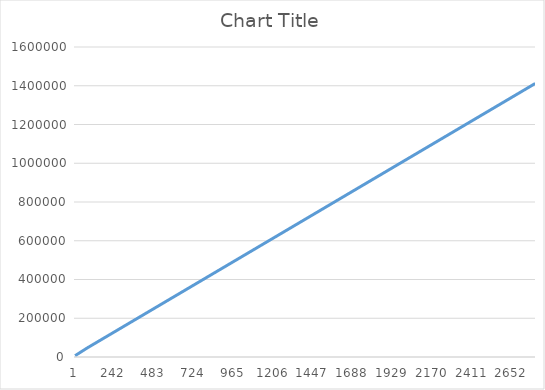
| Category | Series 0 |
|---|---|
| 0 | 6740 |
| 1 | 7282 |
| 2 | 7826 |
| 3 | 8370 |
| 4 | 8914 |
| 5 | 9458 |
| 6 | 10002 |
| 7 | 10546 |
| 8 | 11090 |
| 9 | 11634 |
| 10 | 12178 |
| 11 | 12722 |
| 12 | 13266 |
| 13 | 13810 |
| 14 | 14354 |
| 15 | 14898 |
| 16 | 15442 |
| 17 | 15986 |
| 18 | 16530 |
| 19 | 17074 |
| 20 | 17618 |
| 21 | 18162 |
| 22 | 18706 |
| 23 | 19250 |
| 24 | 19794 |
| 25 | 20338 |
| 26 | 20882 |
| 27 | 21426 |
| 28 | 21970 |
| 29 | 22514 |
| 30 | 23058 |
| 31 | 23602 |
| 32 | 24146 |
| 33 | 24690 |
| 34 | 25234 |
| 35 | 25778 |
| 36 | 26322 |
| 37 | 26866 |
| 38 | 27410 |
| 39 | 27954 |
| 40 | 28498 |
| 41 | 29042 |
| 42 | 29586 |
| 43 | 30130 |
| 44 | 30674 |
| 45 | 31218 |
| 46 | 31762 |
| 47 | 32265 |
| 48 | 32809 |
| 49 | 33353 |
| 50 | 33897 |
| 51 | 34441 |
| 52 | 34985 |
| 53 | 35529 |
| 54 | 36073 |
| 55 | 36617 |
| 56 | 37161 |
| 57 | 37705 |
| 58 | 38249 |
| 59 | 38793 |
| 60 | 39337 |
| 61 | 39881 |
| 62 | 40425 |
| 63 | 40969 |
| 64 | 41513 |
| 65 | 42057 |
| 66 | 42601 |
| 67 | 43145 |
| 68 | 43689 |
| 69 | 44233 |
| 70 | 44777 |
| 71 | 45321 |
| 72 | 45865 |
| 73 | 46409 |
| 74 | 46952 |
| 75 | 47455 |
| 76 | 47958 |
| 77 | 48462 |
| 78 | 48965 |
| 79 | 49468 |
| 80 | 49971 |
| 81 | 50474 |
| 82 | 50977 |
| 83 | 51481 |
| 84 | 51984 |
| 85 | 52487 |
| 86 | 52990 |
| 87 | 53493 |
| 88 | 53997 |
| 89 | 54500 |
| 90 | 55003 |
| 91 | 55506 |
| 92 | 56009 |
| 93 | 56513 |
| 94 | 57016 |
| 95 | 57519 |
| 96 | 58022 |
| 97 | 58525 |
| 98 | 59029 |
| 99 | 59532 |
| 100 | 60035 |
| 101 | 60538 |
| 102 | 61041 |
| 103 | 61545 |
| 104 | 62048 |
| 105 | 62551 |
| 106 | 63054 |
| 107 | 63557 |
| 108 | 64061 |
| 109 | 64564 |
| 110 | 65067 |
| 111 | 65570 |
| 112 | 66073 |
| 113 | 66577 |
| 114 | 67080 |
| 115 | 67583 |
| 116 | 68086 |
| 117 | 68589 |
| 118 | 69092 |
| 119 | 69596 |
| 120 | 70099 |
| 121 | 70602 |
| 122 | 71105 |
| 123 | 71609 |
| 124 | 72112 |
| 125 | 72615 |
| 126 | 73118 |
| 127 | 73621 |
| 128 | 74124 |
| 129 | 74628 |
| 130 | 75131 |
| 131 | 75634 |
| 132 | 76137 |
| 133 | 76640 |
| 134 | 77144 |
| 135 | 77647 |
| 136 | 78150 |
| 137 | 78653 |
| 138 | 79156 |
| 139 | 79660 |
| 140 | 80163 |
| 141 | 80666 |
| 142 | 81169 |
| 143 | 81673 |
| 144 | 82176 |
| 145 | 82692 |
| 146 | 83196 |
| 147 | 83699 |
| 148 | 84202 |
| 149 | 84705 |
| 150 | 85209 |
| 151 | 85712 |
| 152 | 86215 |
| 153 | 86718 |
| 154 | 87221 |
| 155 | 87724 |
| 156 | 88228 |
| 157 | 88731 |
| 158 | 89234 |
| 159 | 89737 |
| 160 | 90240 |
| 161 | 90744 |
| 162 | 91247 |
| 163 | 91750 |
| 164 | 92253 |
| 165 | 92756 |
| 166 | 93260 |
| 167 | 93763 |
| 168 | 94266 |
| 169 | 94769 |
| 170 | 95272 |
| 171 | 95775 |
| 172 | 96279 |
| 173 | 96782 |
| 174 | 97285 |
| 175 | 97788 |
| 176 | 98291 |
| 177 | 98795 |
| 178 | 99298 |
| 179 | 99801 |
| 180 | 100304 |
| 181 | 100807 |
| 182 | 101311 |
| 183 | 101814 |
| 184 | 102317 |
| 185 | 102820 |
| 186 | 103323 |
| 187 | 103827 |
| 188 | 104330 |
| 189 | 104833 |
| 190 | 105336 |
| 191 | 105840 |
| 192 | 106343 |
| 193 | 106846 |
| 194 | 107349 |
| 195 | 107852 |
| 196 | 108355 |
| 197 | 108859 |
| 198 | 109362 |
| 199 | 109865 |
| 200 | 110368 |
| 201 | 110871 |
| 202 | 111375 |
| 203 | 111878 |
| 204 | 112381 |
| 205 | 112884 |
| 206 | 113387 |
| 207 | 113891 |
| 208 | 114394 |
| 209 | 114897 |
| 210 | 115400 |
| 211 | 115903 |
| 212 | 116407 |
| 213 | 116910 |
| 214 | 117413 |
| 215 | 117916 |
| 216 | 118420 |
| 217 | 118923 |
| 218 | 119426 |
| 219 | 119929 |
| 220 | 120432 |
| 221 | 120935 |
| 222 | 121439 |
| 223 | 121942 |
| 224 | 122445 |
| 225 | 122948 |
| 226 | 123451 |
| 227 | 123955 |
| 228 | 124458 |
| 229 | 124961 |
| 230 | 125464 |
| 231 | 125967 |
| 232 | 126471 |
| 233 | 126974 |
| 234 | 127477 |
| 235 | 127980 |
| 236 | 128483 |
| 237 | 128987 |
| 238 | 129490 |
| 239 | 129993 |
| 240 | 130496 |
| 241 | 130999 |
| 242 | 131503 |
| 243 | 132006 |
| 244 | 132509 |
| 245 | 133012 |
| 246 | 133515 |
| 247 | 134018 |
| 248 | 134522 |
| 249 | 135025 |
| 250 | 135528 |
| 251 | 136031 |
| 252 | 136535 |
| 253 | 137038 |
| 254 | 137541 |
| 255 | 138044 |
| 256 | 138547 |
| 257 | 139050 |
| 258 | 139554 |
| 259 | 140057 |
| 260 | 140560 |
| 261 | 141063 |
| 262 | 141566 |
| 263 | 142069 |
| 264 | 142573 |
| 265 | 143076 |
| 266 | 143579 |
| 267 | 144082 |
| 268 | 144586 |
| 269 | 145089 |
| 270 | 145592 |
| 271 | 146095 |
| 272 | 146598 |
| 273 | 147102 |
| 274 | 147605 |
| 275 | 148108 |
| 276 | 148611 |
| 277 | 149114 |
| 278 | 149617 |
| 279 | 150121 |
| 280 | 150624 |
| 281 | 151127 |
| 282 | 151630 |
| 283 | 152133 |
| 284 | 152637 |
| 285 | 153140 |
| 286 | 153643 |
| 287 | 154146 |
| 288 | 154649 |
| 289 | 155153 |
| 290 | 155656 |
| 291 | 156159 |
| 292 | 156662 |
| 293 | 157165 |
| 294 | 157669 |
| 295 | 158172 |
| 296 | 158675 |
| 297 | 159178 |
| 298 | 159681 |
| 299 | 160185 |
| 300 | 160688 |
| 301 | 161191 |
| 302 | 161694 |
| 303 | 162197 |
| 304 | 162701 |
| 305 | 163204 |
| 306 | 163707 |
| 307 | 164237 |
| 308 | 164741 |
| 309 | 165244 |
| 310 | 165747 |
| 311 | 166250 |
| 312 | 166753 |
| 313 | 167257 |
| 314 | 167760 |
| 315 | 168263 |
| 316 | 168766 |
| 317 | 169270 |
| 318 | 169773 |
| 319 | 170276 |
| 320 | 170779 |
| 321 | 171282 |
| 322 | 171786 |
| 323 | 172289 |
| 324 | 172792 |
| 325 | 173295 |
| 326 | 173798 |
| 327 | 174301 |
| 328 | 174805 |
| 329 | 175308 |
| 330 | 175811 |
| 331 | 176314 |
| 332 | 176818 |
| 333 | 177321 |
| 334 | 177824 |
| 335 | 178327 |
| 336 | 178830 |
| 337 | 179333 |
| 338 | 179837 |
| 339 | 180340 |
| 340 | 180843 |
| 341 | 181346 |
| 342 | 181849 |
| 343 | 182353 |
| 344 | 182856 |
| 345 | 183359 |
| 346 | 183862 |
| 347 | 184365 |
| 348 | 184869 |
| 349 | 185372 |
| 350 | 185875 |
| 351 | 186378 |
| 352 | 186881 |
| 353 | 187385 |
| 354 | 187888 |
| 355 | 188391 |
| 356 | 188894 |
| 357 | 189397 |
| 358 | 189901 |
| 359 | 190404 |
| 360 | 190907 |
| 361 | 191410 |
| 362 | 191913 |
| 363 | 192417 |
| 364 | 192920 |
| 365 | 193423 |
| 366 | 193926 |
| 367 | 194429 |
| 368 | 194932 |
| 369 | 195436 |
| 370 | 195939 |
| 371 | 196442 |
| 372 | 196945 |
| 373 | 197448 |
| 374 | 197952 |
| 375 | 198455 |
| 376 | 198958 |
| 377 | 199461 |
| 378 | 199964 |
| 379 | 200468 |
| 380 | 200971 |
| 381 | 201474 |
| 382 | 201977 |
| 383 | 202481 |
| 384 | 202984 |
| 385 | 203487 |
| 386 | 203990 |
| 387 | 204493 |
| 388 | 204996 |
| 389 | 205500 |
| 390 | 206003 |
| 391 | 206506 |
| 392 | 207009 |
| 393 | 207512 |
| 394 | 208016 |
| 395 | 208519 |
| 396 | 209022 |
| 397 | 209525 |
| 398 | 210028 |
| 399 | 210532 |
| 400 | 211035 |
| 401 | 211538 |
| 402 | 212041 |
| 403 | 212544 |
| 404 | 213048 |
| 405 | 213551 |
| 406 | 214054 |
| 407 | 214557 |
| 408 | 215060 |
| 409 | 215564 |
| 410 | 216067 |
| 411 | 216570 |
| 412 | 217073 |
| 413 | 217576 |
| 414 | 218080 |
| 415 | 218583 |
| 416 | 219086 |
| 417 | 219589 |
| 418 | 220092 |
| 419 | 220595 |
| 420 | 221099 |
| 421 | 221602 |
| 422 | 222105 |
| 423 | 222608 |
| 424 | 223111 |
| 425 | 223615 |
| 426 | 224118 |
| 427 | 224621 |
| 428 | 225124 |
| 429 | 225627 |
| 430 | 226131 |
| 431 | 226634 |
| 432 | 227137 |
| 433 | 227640 |
| 434 | 228143 |
| 435 | 228647 |
| 436 | 229150 |
| 437 | 229653 |
| 438 | 230156 |
| 439 | 230659 |
| 440 | 231163 |
| 441 | 231666 |
| 442 | 232169 |
| 443 | 232672 |
| 444 | 233175 |
| 445 | 233678 |
| 446 | 234182 |
| 447 | 234685 |
| 448 | 235188 |
| 449 | 235691 |
| 450 | 236194 |
| 451 | 236698 |
| 452 | 237201 |
| 453 | 237704 |
| 454 | 238207 |
| 455 | 238710 |
| 456 | 239214 |
| 457 | 239717 |
| 458 | 240220 |
| 459 | 240723 |
| 460 | 241227 |
| 461 | 241730 |
| 462 | 242233 |
| 463 | 242736 |
| 464 | 243239 |
| 465 | 243743 |
| 466 | 244246 |
| 467 | 244749 |
| 468 | 245252 |
| 469 | 245755 |
| 470 | 246258 |
| 471 | 246762 |
| 472 | 247265 |
| 473 | 247768 |
| 474 | 248271 |
| 475 | 248774 |
| 476 | 249278 |
| 477 | 249781 |
| 478 | 250284 |
| 479 | 250787 |
| 480 | 251290 |
| 481 | 251793 |
| 482 | 252324 |
| 483 | 252827 |
| 484 | 253330 |
| 485 | 253833 |
| 486 | 254337 |
| 487 | 254840 |
| 488 | 255343 |
| 489 | 255846 |
| 490 | 256350 |
| 491 | 256853 |
| 492 | 257356 |
| 493 | 257859 |
| 494 | 258362 |
| 495 | 258865 |
| 496 | 259369 |
| 497 | 259872 |
| 498 | 260375 |
| 499 | 260878 |
| 500 | 261381 |
| 501 | 261885 |
| 502 | 262388 |
| 503 | 262891 |
| 504 | 263394 |
| 505 | 263897 |
| 506 | 264401 |
| 507 | 264904 |
| 508 | 265407 |
| 509 | 265910 |
| 510 | 266413 |
| 511 | 266917 |
| 512 | 267420 |
| 513 | 267923 |
| 514 | 268426 |
| 515 | 268929 |
| 516 | 269433 |
| 517 | 269936 |
| 518 | 270439 |
| 519 | 270942 |
| 520 | 271445 |
| 521 | 271949 |
| 522 | 272452 |
| 523 | 272955 |
| 524 | 273458 |
| 525 | 273961 |
| 526 | 274464 |
| 527 | 274968 |
| 528 | 275471 |
| 529 | 275974 |
| 530 | 276477 |
| 531 | 276980 |
| 532 | 277484 |
| 533 | 277987 |
| 534 | 278490 |
| 535 | 278993 |
| 536 | 279496 |
| 537 | 280000 |
| 538 | 280503 |
| 539 | 281006 |
| 540 | 281509 |
| 541 | 282012 |
| 542 | 282516 |
| 543 | 283019 |
| 544 | 283522 |
| 545 | 284025 |
| 546 | 284528 |
| 547 | 285032 |
| 548 | 285535 |
| 549 | 286038 |
| 550 | 286541 |
| 551 | 287044 |
| 552 | 287548 |
| 553 | 288051 |
| 554 | 288554 |
| 555 | 289057 |
| 556 | 289560 |
| 557 | 290064 |
| 558 | 290567 |
| 559 | 291070 |
| 560 | 291573 |
| 561 | 292076 |
| 562 | 292580 |
| 563 | 293083 |
| 564 | 293586 |
| 565 | 294089 |
| 566 | 294592 |
| 567 | 295096 |
| 568 | 295599 |
| 569 | 296102 |
| 570 | 296605 |
| 571 | 297108 |
| 572 | 297612 |
| 573 | 298115 |
| 574 | 298618 |
| 575 | 299121 |
| 576 | 299624 |
| 577 | 300128 |
| 578 | 300631 |
| 579 | 301134 |
| 580 | 301637 |
| 581 | 302140 |
| 582 | 302644 |
| 583 | 303147 |
| 584 | 303650 |
| 585 | 304153 |
| 586 | 304657 |
| 587 | 305160 |
| 588 | 305663 |
| 589 | 306166 |
| 590 | 306669 |
| 591 | 307172 |
| 592 | 307676 |
| 593 | 308179 |
| 594 | 308682 |
| 595 | 309185 |
| 596 | 309688 |
| 597 | 310191 |
| 598 | 310695 |
| 599 | 311198 |
| 600 | 311701 |
| 601 | 312204 |
| 602 | 312708 |
| 603 | 313211 |
| 604 | 313714 |
| 605 | 314217 |
| 606 | 314720 |
| 607 | 315224 |
| 608 | 315727 |
| 609 | 316230 |
| 610 | 316733 |
| 611 | 317236 |
| 612 | 317739 |
| 613 | 318243 |
| 614 | 318746 |
| 615 | 319249 |
| 616 | 319752 |
| 617 | 320255 |
| 618 | 320759 |
| 619 | 321262 |
| 620 | 321765 |
| 621 | 322268 |
| 622 | 322771 |
| 623 | 323274 |
| 624 | 323778 |
| 625 | 324281 |
| 626 | 324784 |
| 627 | 325287 |
| 628 | 325791 |
| 629 | 326294 |
| 630 | 326797 |
| 631 | 327300 |
| 632 | 327803 |
| 633 | 328307 |
| 634 | 328810 |
| 635 | 329313 |
| 636 | 329816 |
| 637 | 330319 |
| 638 | 330823 |
| 639 | 331326 |
| 640 | 331829 |
| 641 | 332332 |
| 642 | 332835 |
| 643 | 333338 |
| 644 | 333842 |
| 645 | 334345 |
| 646 | 334848 |
| 647 | 335351 |
| 648 | 335854 |
| 649 | 336358 |
| 650 | 336861 |
| 651 | 337364 |
| 652 | 337867 |
| 653 | 338370 |
| 654 | 338887 |
| 655 | 339391 |
| 656 | 339894 |
| 657 | 340397 |
| 658 | 340900 |
| 659 | 341403 |
| 660 | 341906 |
| 661 | 342410 |
| 662 | 342913 |
| 663 | 343416 |
| 664 | 343919 |
| 665 | 344422 |
| 666 | 344926 |
| 667 | 345429 |
| 668 | 345932 |
| 669 | 346435 |
| 670 | 346938 |
| 671 | 347442 |
| 672 | 347945 |
| 673 | 348448 |
| 674 | 348951 |
| 675 | 349454 |
| 676 | 349958 |
| 677 | 350461 |
| 678 | 350964 |
| 679 | 351467 |
| 680 | 351970 |
| 681 | 352473 |
| 682 | 352977 |
| 683 | 353480 |
| 684 | 353983 |
| 685 | 354486 |
| 686 | 354989 |
| 687 | 355493 |
| 688 | 355996 |
| 689 | 356499 |
| 690 | 357002 |
| 691 | 357505 |
| 692 | 358009 |
| 693 | 358512 |
| 694 | 359015 |
| 695 | 359518 |
| 696 | 360022 |
| 697 | 360525 |
| 698 | 361028 |
| 699 | 361531 |
| 700 | 362034 |
| 701 | 362538 |
| 702 | 363041 |
| 703 | 363544 |
| 704 | 364047 |
| 705 | 364550 |
| 706 | 365054 |
| 707 | 365557 |
| 708 | 366060 |
| 709 | 366563 |
| 710 | 367066 |
| 711 | 367570 |
| 712 | 368073 |
| 713 | 368576 |
| 714 | 369079 |
| 715 | 369582 |
| 716 | 370086 |
| 717 | 370589 |
| 718 | 371092 |
| 719 | 371595 |
| 720 | 372098 |
| 721 | 372602 |
| 722 | 373105 |
| 723 | 373608 |
| 724 | 374111 |
| 725 | 374614 |
| 726 | 375118 |
| 727 | 375621 |
| 728 | 376124 |
| 729 | 376627 |
| 730 | 377130 |
| 731 | 377633 |
| 732 | 378137 |
| 733 | 378640 |
| 734 | 379143 |
| 735 | 379646 |
| 736 | 380149 |
| 737 | 380653 |
| 738 | 381156 |
| 739 | 381659 |
| 740 | 382162 |
| 741 | 382665 |
| 742 | 383168 |
| 743 | 383672 |
| 744 | 384175 |
| 745 | 384678 |
| 746 | 385181 |
| 747 | 385684 |
| 748 | 386188 |
| 749 | 386691 |
| 750 | 387194 |
| 751 | 387697 |
| 752 | 388200 |
| 753 | 388704 |
| 754 | 389207 |
| 755 | 389710 |
| 756 | 390213 |
| 757 | 390717 |
| 758 | 391219 |
| 759 | 391723 |
| 760 | 392226 |
| 761 | 392729 |
| 762 | 393232 |
| 763 | 393736 |
| 764 | 394239 |
| 765 | 394742 |
| 766 | 395245 |
| 767 | 395748 |
| 768 | 396252 |
| 769 | 396755 |
| 770 | 397258 |
| 771 | 397761 |
| 772 | 398264 |
| 773 | 398768 |
| 774 | 399271 |
| 775 | 399774 |
| 776 | 400277 |
| 777 | 400780 |
| 778 | 401284 |
| 779 | 401787 |
| 780 | 402290 |
| 781 | 402793 |
| 782 | 403296 |
| 783 | 403800 |
| 784 | 404303 |
| 785 | 404806 |
| 786 | 405309 |
| 787 | 405812 |
| 788 | 406316 |
| 789 | 406819 |
| 790 | 407322 |
| 791 | 407825 |
| 792 | 408328 |
| 793 | 408832 |
| 794 | 409335 |
| 795 | 409838 |
| 796 | 410341 |
| 797 | 410844 |
| 798 | 411348 |
| 799 | 411851 |
| 800 | 412354 |
| 801 | 412857 |
| 802 | 413360 |
| 803 | 413863 |
| 804 | 414367 |
| 805 | 414870 |
| 806 | 415373 |
| 807 | 415876 |
| 808 | 416380 |
| 809 | 416883 |
| 810 | 417386 |
| 811 | 417889 |
| 812 | 418392 |
| 813 | 418896 |
| 814 | 419399 |
| 815 | 419902 |
| 816 | 420419 |
| 817 | 420922 |
| 818 | 421425 |
| 819 | 421928 |
| 820 | 422431 |
| 821 | 422935 |
| 822 | 423438 |
| 823 | 423941 |
| 824 | 424444 |
| 825 | 424948 |
| 826 | 425451 |
| 827 | 425954 |
| 828 | 426457 |
| 829 | 426960 |
| 830 | 427463 |
| 831 | 427967 |
| 832 | 428470 |
| 833 | 428973 |
| 834 | 429476 |
| 835 | 429979 |
| 836 | 430483 |
| 837 | 430986 |
| 838 | 431489 |
| 839 | 431992 |
| 840 | 432495 |
| 841 | 432999 |
| 842 | 433502 |
| 843 | 434005 |
| 844 | 434508 |
| 845 | 435011 |
| 846 | 435515 |
| 847 | 436018 |
| 848 | 436521 |
| 849 | 437024 |
| 850 | 437527 |
| 851 | 438031 |
| 852 | 438534 |
| 853 | 439037 |
| 854 | 439540 |
| 855 | 440043 |
| 856 | 440547 |
| 857 | 441050 |
| 858 | 441553 |
| 859 | 442056 |
| 860 | 442559 |
| 861 | 443062 |
| 862 | 443566 |
| 863 | 444069 |
| 864 | 444572 |
| 865 | 445075 |
| 866 | 445578 |
| 867 | 446082 |
| 868 | 446585 |
| 869 | 447088 |
| 870 | 447591 |
| 871 | 448095 |
| 872 | 448598 |
| 873 | 449101 |
| 874 | 449604 |
| 875 | 450107 |
| 876 | 450611 |
| 877 | 451114 |
| 878 | 451617 |
| 879 | 452120 |
| 880 | 452623 |
| 881 | 453126 |
| 882 | 453630 |
| 883 | 454133 |
| 884 | 454636 |
| 885 | 455139 |
| 886 | 455642 |
| 887 | 456145 |
| 888 | 456649 |
| 889 | 457152 |
| 890 | 457655 |
| 891 | 458158 |
| 892 | 458662 |
| 893 | 459165 |
| 894 | 459668 |
| 895 | 460171 |
| 896 | 460674 |
| 897 | 461178 |
| 898 | 461681 |
| 899 | 462184 |
| 900 | 462687 |
| 901 | 463190 |
| 902 | 463694 |
| 903 | 464197 |
| 904 | 464700 |
| 905 | 465203 |
| 906 | 465706 |
| 907 | 466209 |
| 908 | 466713 |
| 909 | 467216 |
| 910 | 467719 |
| 911 | 468222 |
| 912 | 468725 |
| 913 | 469228 |
| 914 | 469732 |
| 915 | 470235 |
| 916 | 470738 |
| 917 | 471241 |
| 918 | 471745 |
| 919 | 472248 |
| 920 | 472751 |
| 921 | 473254 |
| 922 | 473757 |
| 923 | 474261 |
| 924 | 474764 |
| 925 | 475267 |
| 926 | 475770 |
| 927 | 476273 |
| 928 | 476777 |
| 929 | 477280 |
| 930 | 477783 |
| 931 | 478286 |
| 932 | 478789 |
| 933 | 479293 |
| 934 | 479796 |
| 935 | 480299 |
| 936 | 480802 |
| 937 | 481305 |
| 938 | 481809 |
| 939 | 482312 |
| 940 | 482815 |
| 941 | 483318 |
| 942 | 483821 |
| 943 | 484325 |
| 944 | 484828 |
| 945 | 485331 |
| 946 | 485834 |
| 947 | 486337 |
| 948 | 486840 |
| 949 | 487344 |
| 950 | 487847 |
| 951 | 488350 |
| 952 | 488853 |
| 953 | 489357 |
| 954 | 489860 |
| 955 | 490363 |
| 956 | 490866 |
| 957 | 491369 |
| 958 | 491872 |
| 959 | 492376 |
| 960 | 492879 |
| 961 | 493382 |
| 962 | 493885 |
| 963 | 494388 |
| 964 | 494892 |
| 965 | 495395 |
| 966 | 495898 |
| 967 | 496401 |
| 968 | 496904 |
| 969 | 497408 |
| 970 | 497911 |
| 971 | 498414 |
| 972 | 498917 |
| 973 | 499420 |
| 974 | 499924 |
| 975 | 500427 |
| 976 | 500930 |
| 977 | 501433 |
| 978 | 501936 |
| 979 | 502440 |
| 980 | 502943 |
| 981 | 503446 |
| 982 | 503949 |
| 983 | 504452 |
| 984 | 504956 |
| 985 | 505459 |
| 986 | 505962 |
| 987 | 506465 |
| 988 | 506968 |
| 989 | 507471 |
| 990 | 507975 |
| 991 | 508478 |
| 992 | 508981 |
| 993 | 509484 |
| 994 | 509988 |
| 995 | 510491 |
| 996 | 510994 |
| 997 | 511497 |
| 998 | 512000 |
| 999 | 512504 |
| 1000 | 513007 |
| 1001 | 513510 |
| 1002 | 514013 |
| 1003 | 514516 |
| 1004 | 515020 |
| 1005 | 515523 |
| 1006 | 516026 |
| 1007 | 516529 |
| 1008 | 517032 |
| 1009 | 517536 |
| 1010 | 518039 |
| 1011 | 518542 |
| 1012 | 519045 |
| 1013 | 519548 |
| 1014 | 520051 |
| 1015 | 520555 |
| 1016 | 521058 |
| 1017 | 521561 |
| 1018 | 522064 |
| 1019 | 522567 |
| 1020 | 523070 |
| 1021 | 523574 |
| 1022 | 524077 |
| 1023 | 524580 |
| 1024 | 525083 |
| 1025 | 525586 |
| 1026 | 526090 |
| 1027 | 526593 |
| 1028 | 527096 |
| 1029 | 527599 |
| 1030 | 528102 |
| 1031 | 528606 |
| 1032 | 529109 |
| 1033 | 529612 |
| 1034 | 530115 |
| 1035 | 530618 |
| 1036 | 531122 |
| 1037 | 531625 |
| 1038 | 532128 |
| 1039 | 532631 |
| 1040 | 533134 |
| 1041 | 533638 |
| 1042 | 534141 |
| 1043 | 534644 |
| 1044 | 535147 |
| 1045 | 535650 |
| 1046 | 536154 |
| 1047 | 536657 |
| 1048 | 537160 |
| 1049 | 537663 |
| 1050 | 538166 |
| 1051 | 538670 |
| 1052 | 539173 |
| 1053 | 539676 |
| 1054 | 540179 |
| 1055 | 540683 |
| 1056 | 541186 |
| 1057 | 541689 |
| 1058 | 542192 |
| 1059 | 542695 |
| 1060 | 543198 |
| 1061 | 543702 |
| 1062 | 544205 |
| 1063 | 544708 |
| 1064 | 545211 |
| 1065 | 545715 |
| 1066 | 546218 |
| 1067 | 546721 |
| 1068 | 547224 |
| 1069 | 547727 |
| 1070 | 548230 |
| 1071 | 548734 |
| 1072 | 549237 |
| 1073 | 549740 |
| 1074 | 550243 |
| 1075 | 550746 |
| 1076 | 551250 |
| 1077 | 551753 |
| 1078 | 552256 |
| 1079 | 552759 |
| 1080 | 553262 |
| 1081 | 553766 |
| 1082 | 554269 |
| 1083 | 554772 |
| 1084 | 555275 |
| 1085 | 555778 |
| 1086 | 556282 |
| 1087 | 556785 |
| 1088 | 557288 |
| 1089 | 557791 |
| 1090 | 558294 |
| 1091 | 558798 |
| 1092 | 559301 |
| 1093 | 559804 |
| 1094 | 560307 |
| 1095 | 560810 |
| 1096 | 561313 |
| 1097 | 561817 |
| 1098 | 562320 |
| 1099 | 562823 |
| 1100 | 563326 |
| 1101 | 563830 |
| 1102 | 564333 |
| 1103 | 564836 |
| 1104 | 565339 |
| 1105 | 565842 |
| 1106 | 566346 |
| 1107 | 566849 |
| 1108 | 567352 |
| 1109 | 567855 |
| 1110 | 568358 |
| 1111 | 568861 |
| 1112 | 569365 |
| 1113 | 569868 |
| 1114 | 570371 |
| 1115 | 570874 |
| 1116 | 571377 |
| 1117 | 571881 |
| 1118 | 572384 |
| 1119 | 572887 |
| 1120 | 573390 |
| 1121 | 573893 |
| 1122 | 574397 |
| 1123 | 574900 |
| 1124 | 575403 |
| 1125 | 575906 |
| 1126 | 576409 |
| 1127 | 576913 |
| 1128 | 577416 |
| 1129 | 577919 |
| 1130 | 578422 |
| 1131 | 578925 |
| 1132 | 579429 |
| 1133 | 579932 |
| 1134 | 580435 |
| 1135 | 580938 |
| 1136 | 581441 |
| 1137 | 581945 |
| 1138 | 582448 |
| 1139 | 582951 |
| 1140 | 583454 |
| 1141 | 583957 |
| 1142 | 584461 |
| 1143 | 584964 |
| 1144 | 585467 |
| 1145 | 585970 |
| 1146 | 586473 |
| 1147 | 586977 |
| 1148 | 587480 |
| 1149 | 587983 |
| 1150 | 588486 |
| 1151 | 588989 |
| 1152 | 589493 |
| 1153 | 589996 |
| 1154 | 590499 |
| 1155 | 591002 |
| 1156 | 591505 |
| 1157 | 592009 |
| 1158 | 592512 |
| 1159 | 593015 |
| 1160 | 593518 |
| 1161 | 594021 |
| 1162 | 594525 |
| 1163 | 595028 |
| 1164 | 595531 |
| 1165 | 596034 |
| 1166 | 596537 |
| 1167 | 597041 |
| 1168 | 597544 |
| 1169 | 598047 |
| 1170 | 598550 |
| 1171 | 599053 |
| 1172 | 599557 |
| 1173 | 600060 |
| 1174 | 600563 |
| 1175 | 601066 |
| 1176 | 601569 |
| 1177 | 602073 |
| 1178 | 602576 |
| 1179 | 603079 |
| 1180 | 603582 |
| 1181 | 604085 |
| 1182 | 604589 |
| 1183 | 605092 |
| 1184 | 605595 |
| 1185 | 606098 |
| 1186 | 606601 |
| 1187 | 607104 |
| 1188 | 607608 |
| 1189 | 608111 |
| 1190 | 608614 |
| 1191 | 609117 |
| 1192 | 609620 |
| 1193 | 610123 |
| 1194 | 610627 |
| 1195 | 611130 |
| 1196 | 611633 |
| 1197 | 612136 |
| 1198 | 612640 |
| 1199 | 613143 |
| 1200 | 613646 |
| 1201 | 614149 |
| 1202 | 614652 |
| 1203 | 615155 |
| 1204 | 615659 |
| 1205 | 616162 |
| 1206 | 616665 |
| 1207 | 617168 |
| 1208 | 617671 |
| 1209 | 618175 |
| 1210 | 618678 |
| 1211 | 619181 |
| 1212 | 619684 |
| 1213 | 620187 |
| 1214 | 620691 |
| 1215 | 621194 |
| 1216 | 621697 |
| 1217 | 622200 |
| 1218 | 622703 |
| 1219 | 623207 |
| 1220 | 623710 |
| 1221 | 624213 |
| 1222 | 624716 |
| 1223 | 625219 |
| 1224 | 625723 |
| 1225 | 626226 |
| 1226 | 626729 |
| 1227 | 627232 |
| 1228 | 627735 |
| 1229 | 628239 |
| 1230 | 628742 |
| 1231 | 629245 |
| 1232 | 629748 |
| 1233 | 630251 |
| 1234 | 630755 |
| 1235 | 631258 |
| 1236 | 631761 |
| 1237 | 632264 |
| 1238 | 632767 |
| 1239 | 633271 |
| 1240 | 633774 |
| 1241 | 634277 |
| 1242 | 634780 |
| 1243 | 635283 |
| 1244 | 635786 |
| 1245 | 636290 |
| 1246 | 636793 |
| 1247 | 637296 |
| 1248 | 637799 |
| 1249 | 638302 |
| 1250 | 638806 |
| 1251 | 639309 |
| 1252 | 639812 |
| 1253 | 640315 |
| 1254 | 640819 |
| 1255 | 641322 |
| 1256 | 641825 |
| 1257 | 642328 |
| 1258 | 642831 |
| 1259 | 643335 |
| 1260 | 643838 |
| 1261 | 644341 |
| 1262 | 644844 |
| 1263 | 645347 |
| 1264 | 645851 |
| 1265 | 646354 |
| 1266 | 646857 |
| 1267 | 647360 |
| 1268 | 647863 |
| 1269 | 648366 |
| 1270 | 648870 |
| 1271 | 649373 |
| 1272 | 649876 |
| 1273 | 650379 |
| 1274 | 650882 |
| 1275 | 651386 |
| 1276 | 651889 |
| 1277 | 652392 |
| 1278 | 652895 |
| 1279 | 653399 |
| 1280 | 653902 |
| 1281 | 654405 |
| 1282 | 654908 |
| 1283 | 655411 |
| 1284 | 655914 |
| 1285 | 656418 |
| 1286 | 656921 |
| 1287 | 657424 |
| 1288 | 657927 |
| 1289 | 658430 |
| 1290 | 658934 |
| 1291 | 659437 |
| 1292 | 659940 |
| 1293 | 660443 |
| 1294 | 660946 |
| 1295 | 661449 |
| 1296 | 661953 |
| 1297 | 662456 |
| 1298 | 662959 |
| 1299 | 663462 |
| 1300 | 663965 |
| 1301 | 664469 |
| 1302 | 664972 |
| 1303 | 665475 |
| 1304 | 665978 |
| 1305 | 666481 |
| 1306 | 666985 |
| 1307 | 667488 |
| 1308 | 667991 |
| 1309 | 668494 |
| 1310 | 668998 |
| 1311 | 669501 |
| 1312 | 670004 |
| 1313 | 670507 |
| 1314 | 671010 |
| 1315 | 671514 |
| 1316 | 672017 |
| 1317 | 672520 |
| 1318 | 673023 |
| 1319 | 673540 |
| 1320 | 674043 |
| 1321 | 674546 |
| 1322 | 675049 |
| 1323 | 675553 |
| 1324 | 676056 |
| 1325 | 676559 |
| 1326 | 677062 |
| 1327 | 677566 |
| 1328 | 678069 |
| 1329 | 678572 |
| 1330 | 679075 |
| 1331 | 679578 |
| 1332 | 680081 |
| 1333 | 680585 |
| 1334 | 681088 |
| 1335 | 681591 |
| 1336 | 682094 |
| 1337 | 682598 |
| 1338 | 683101 |
| 1339 | 683604 |
| 1340 | 684107 |
| 1341 | 684610 |
| 1342 | 685113 |
| 1343 | 685616 |
| 1344 | 686120 |
| 1345 | 686623 |
| 1346 | 687126 |
| 1347 | 687629 |
| 1348 | 688133 |
| 1349 | 688636 |
| 1350 | 689139 |
| 1351 | 689642 |
| 1352 | 690145 |
| 1353 | 690649 |
| 1354 | 691152 |
| 1355 | 691655 |
| 1356 | 692158 |
| 1357 | 692661 |
| 1358 | 693165 |
| 1359 | 693668 |
| 1360 | 694171 |
| 1361 | 694674 |
| 1362 | 695177 |
| 1363 | 695680 |
| 1364 | 696184 |
| 1365 | 696687 |
| 1366 | 697190 |
| 1367 | 697693 |
| 1368 | 698197 |
| 1369 | 698700 |
| 1370 | 699203 |
| 1371 | 699706 |
| 1372 | 700209 |
| 1373 | 700712 |
| 1374 | 701216 |
| 1375 | 701719 |
| 1376 | 702222 |
| 1377 | 702725 |
| 1378 | 703228 |
| 1379 | 703732 |
| 1380 | 704235 |
| 1381 | 704738 |
| 1382 | 705241 |
| 1383 | 705744 |
| 1384 | 706248 |
| 1385 | 706751 |
| 1386 | 707254 |
| 1387 | 707757 |
| 1388 | 708260 |
| 1389 | 708764 |
| 1390 | 709267 |
| 1391 | 709770 |
| 1392 | 710273 |
| 1393 | 710776 |
| 1394 | 711279 |
| 1395 | 711783 |
| 1396 | 712286 |
| 1397 | 712789 |
| 1398 | 713292 |
| 1399 | 713796 |
| 1400 | 714299 |
| 1401 | 714802 |
| 1402 | 715305 |
| 1403 | 715808 |
| 1404 | 716312 |
| 1405 | 716815 |
| 1406 | 717318 |
| 1407 | 717821 |
| 1408 | 718324 |
| 1409 | 718827 |
| 1410 | 719331 |
| 1411 | 719834 |
| 1412 | 720337 |
| 1413 | 720840 |
| 1414 | 721343 |
| 1415 | 721847 |
| 1416 | 722350 |
| 1417 | 722853 |
| 1418 | 723356 |
| 1419 | 723859 |
| 1420 | 724362 |
| 1421 | 724866 |
| 1422 | 725369 |
| 1423 | 725872 |
| 1424 | 726375 |
| 1425 | 726878 |
| 1426 | 727382 |
| 1427 | 727885 |
| 1428 | 728388 |
| 1429 | 728891 |
| 1430 | 729394 |
| 1431 | 729898 |
| 1432 | 730401 |
| 1433 | 730904 |
| 1434 | 731407 |
| 1435 | 731911 |
| 1436 | 732414 |
| 1437 | 732917 |
| 1438 | 733420 |
| 1439 | 733923 |
| 1440 | 734426 |
| 1441 | 734930 |
| 1442 | 735433 |
| 1443 | 735936 |
| 1444 | 736439 |
| 1445 | 736942 |
| 1446 | 737446 |
| 1447 | 737949 |
| 1448 | 738452 |
| 1449 | 738955 |
| 1450 | 739458 |
| 1451 | 739962 |
| 1452 | 740465 |
| 1453 | 740968 |
| 1454 | 741471 |
| 1455 | 741974 |
| 1456 | 742478 |
| 1457 | 742981 |
| 1458 | 743484 |
| 1459 | 743987 |
| 1460 | 744490 |
| 1461 | 744993 |
| 1462 | 745497 |
| 1463 | 746000 |
| 1464 | 746503 |
| 1465 | 747006 |
| 1466 | 747510 |
| 1467 | 748013 |
| 1468 | 748516 |
| 1469 | 749019 |
| 1470 | 749522 |
| 1471 | 750026 |
| 1472 | 750529 |
| 1473 | 751032 |
| 1474 | 751535 |
| 1475 | 752038 |
| 1476 | 752542 |
| 1477 | 753045 |
| 1478 | 753548 |
| 1479 | 754051 |
| 1480 | 754554 |
| 1481 | 755057 |
| 1482 | 755561 |
| 1483 | 756064 |
| 1484 | 756594 |
| 1485 | 757098 |
| 1486 | 757601 |
| 1487 | 758104 |
| 1488 | 758607 |
| 1489 | 759111 |
| 1490 | 759614 |
| 1491 | 760117 |
| 1492 | 760620 |
| 1493 | 761123 |
| 1494 | 761626 |
| 1495 | 762130 |
| 1496 | 762633 |
| 1497 | 763136 |
| 1498 | 763639 |
| 1499 | 764142 |
| 1500 | 764646 |
| 1501 | 765149 |
| 1502 | 765652 |
| 1503 | 766155 |
| 1504 | 766658 |
| 1505 | 767162 |
| 1506 | 767665 |
| 1507 | 768168 |
| 1508 | 768671 |
| 1509 | 769174 |
| 1510 | 769678 |
| 1511 | 770181 |
| 1512 | 770684 |
| 1513 | 771187 |
| 1514 | 771690 |
| 1515 | 772194 |
| 1516 | 772697 |
| 1517 | 773200 |
| 1518 | 773703 |
| 1519 | 774206 |
| 1520 | 774710 |
| 1521 | 775213 |
| 1522 | 775716 |
| 1523 | 776219 |
| 1524 | 776722 |
| 1525 | 777225 |
| 1526 | 777729 |
| 1527 | 778232 |
| 1528 | 778735 |
| 1529 | 779238 |
| 1530 | 779741 |
| 1531 | 780244 |
| 1532 | 780748 |
| 1533 | 781251 |
| 1534 | 781754 |
| 1535 | 782257 |
| 1536 | 782761 |
| 1537 | 783264 |
| 1538 | 783767 |
| 1539 | 784270 |
| 1540 | 784773 |
| 1541 | 785277 |
| 1542 | 785780 |
| 1543 | 786283 |
| 1544 | 786786 |
| 1545 | 787289 |
| 1546 | 787793 |
| 1547 | 788296 |
| 1548 | 788799 |
| 1549 | 789302 |
| 1550 | 789806 |
| 1551 | 790309 |
| 1552 | 790812 |
| 1553 | 791315 |
| 1554 | 791818 |
| 1555 | 792321 |
| 1556 | 792824 |
| 1557 | 793328 |
| 1558 | 793831 |
| 1559 | 794334 |
| 1560 | 794837 |
| 1561 | 795340 |
| 1562 | 795844 |
| 1563 | 796347 |
| 1564 | 796850 |
| 1565 | 797353 |
| 1566 | 797856 |
| 1567 | 798360 |
| 1568 | 798863 |
| 1569 | 799366 |
| 1570 | 799869 |
| 1571 | 800372 |
| 1572 | 800876 |
| 1573 | 801379 |
| 1574 | 801882 |
| 1575 | 802385 |
| 1576 | 802888 |
| 1577 | 803392 |
| 1578 | 803895 |
| 1579 | 804398 |
| 1580 | 804901 |
| 1581 | 805404 |
| 1582 | 805908 |
| 1583 | 806411 |
| 1584 | 806914 |
| 1585 | 807417 |
| 1586 | 807920 |
| 1587 | 808423 |
| 1588 | 808927 |
| 1589 | 809430 |
| 1590 | 809933 |
| 1591 | 810436 |
| 1592 | 810940 |
| 1593 | 811443 |
| 1594 | 811946 |
| 1595 | 812449 |
| 1596 | 812952 |
| 1597 | 813455 |
| 1598 | 813959 |
| 1599 | 814462 |
| 1600 | 814965 |
| 1601 | 815468 |
| 1602 | 815971 |
| 1603 | 816475 |
| 1604 | 816978 |
| 1605 | 817481 |
| 1606 | 817984 |
| 1607 | 818487 |
| 1608 | 818991 |
| 1609 | 819494 |
| 1610 | 819997 |
| 1611 | 820500 |
| 1612 | 821003 |
| 1613 | 821507 |
| 1614 | 822010 |
| 1615 | 822513 |
| 1616 | 823016 |
| 1617 | 823520 |
| 1618 | 824023 |
| 1619 | 824526 |
| 1620 | 825029 |
| 1621 | 825532 |
| 1622 | 826036 |
| 1623 | 826539 |
| 1624 | 827042 |
| 1625 | 827545 |
| 1626 | 828048 |
| 1627 | 828552 |
| 1628 | 829055 |
| 1629 | 829558 |
| 1630 | 830061 |
| 1631 | 830564 |
| 1632 | 831067 |
| 1633 | 831571 |
| 1634 | 832074 |
| 1635 | 832577 |
| 1636 | 833080 |
| 1637 | 833583 |
| 1638 | 834087 |
| 1639 | 834590 |
| 1640 | 835093 |
| 1641 | 835596 |
| 1642 | 836099 |
| 1643 | 836603 |
| 1644 | 837106 |
| 1645 | 837609 |
| 1646 | 838112 |
| 1647 | 838615 |
| 1648 | 839119 |
| 1649 | 839622 |
| 1650 | 840125 |
| 1651 | 840628 |
| 1652 | 841131 |
| 1653 | 841635 |
| 1654 | 842138 |
| 1655 | 842641 |
| 1656 | 843144 |
| 1657 | 843661 |
| 1658 | 844164 |
| 1659 | 844667 |
| 1660 | 845171 |
| 1661 | 845674 |
| 1662 | 846177 |
| 1663 | 846680 |
| 1664 | 847183 |
| 1665 | 847687 |
| 1666 | 848190 |
| 1667 | 848693 |
| 1668 | 849196 |
| 1669 | 849699 |
| 1670 | 850203 |
| 1671 | 850706 |
| 1672 | 851209 |
| 1673 | 851712 |
| 1674 | 852215 |
| 1675 | 852719 |
| 1676 | 853222 |
| 1677 | 853725 |
| 1678 | 854228 |
| 1679 | 854731 |
| 1680 | 855235 |
| 1681 | 855738 |
| 1682 | 856241 |
| 1683 | 856744 |
| 1684 | 857247 |
| 1685 | 857750 |
| 1686 | 858254 |
| 1687 | 858757 |
| 1688 | 859260 |
| 1689 | 859763 |
| 1690 | 860267 |
| 1691 | 860770 |
| 1692 | 861273 |
| 1693 | 861776 |
| 1694 | 862279 |
| 1695 | 862782 |
| 1696 | 863286 |
| 1697 | 863789 |
| 1698 | 864292 |
| 1699 | 864795 |
| 1700 | 865299 |
| 1701 | 865802 |
| 1702 | 866305 |
| 1703 | 866808 |
| 1704 | 867311 |
| 1705 | 867814 |
| 1706 | 868318 |
| 1707 | 868821 |
| 1708 | 869324 |
| 1709 | 869827 |
| 1710 | 870330 |
| 1711 | 870834 |
| 1712 | 871337 |
| 1713 | 871840 |
| 1714 | 872343 |
| 1715 | 872846 |
| 1716 | 873350 |
| 1717 | 873853 |
| 1718 | 874356 |
| 1719 | 874859 |
| 1720 | 875362 |
| 1721 | 875866 |
| 1722 | 876369 |
| 1723 | 876872 |
| 1724 | 877375 |
| 1725 | 877878 |
| 1726 | 878381 |
| 1727 | 878885 |
| 1728 | 879388 |
| 1729 | 879891 |
| 1730 | 880394 |
| 1731 | 880898 |
| 1732 | 881401 |
| 1733 | 881904 |
| 1734 | 882407 |
| 1735 | 882910 |
| 1736 | 883414 |
| 1737 | 883917 |
| 1738 | 884420 |
| 1739 | 884923 |
| 1740 | 885426 |
| 1741 | 885930 |
| 1742 | 886433 |
| 1743 | 886936 |
| 1744 | 887439 |
| 1745 | 887942 |
| 1746 | 888445 |
| 1747 | 888949 |
| 1748 | 889452 |
| 1749 | 889955 |
| 1750 | 890458 |
| 1751 | 890961 |
| 1752 | 891465 |
| 1753 | 891968 |
| 1754 | 892471 |
| 1755 | 892974 |
| 1756 | 893477 |
| 1757 | 893981 |
| 1758 | 894484 |
| 1759 | 894987 |
| 1760 | 895490 |
| 1761 | 895993 |
| 1762 | 896497 |
| 1763 | 897000 |
| 1764 | 897503 |
| 1765 | 898006 |
| 1766 | 898509 |
| 1767 | 899013 |
| 1768 | 899516 |
| 1769 | 900019 |
| 1770 | 900522 |
| 1771 | 901025 |
| 1772 | 901529 |
| 1773 | 902032 |
| 1774 | 902535 |
| 1775 | 903038 |
| 1776 | 903541 |
| 1777 | 904045 |
| 1778 | 904548 |
| 1779 | 905051 |
| 1780 | 905554 |
| 1781 | 906057 |
| 1782 | 906561 |
| 1783 | 907064 |
| 1784 | 907567 |
| 1785 | 908070 |
| 1786 | 908573 |
| 1787 | 909077 |
| 1788 | 909580 |
| 1789 | 910083 |
| 1790 | 910586 |
| 1791 | 911089 |
| 1792 | 911593 |
| 1793 | 912096 |
| 1794 | 912599 |
| 1795 | 913102 |
| 1796 | 913605 |
| 1797 | 914109 |
| 1798 | 914612 |
| 1799 | 915115 |
| 1800 | 915618 |
| 1801 | 916121 |
| 1802 | 916625 |
| 1803 | 917128 |
| 1804 | 917631 |
| 1805 | 918134 |
| 1806 | 918637 |
| 1807 | 919140 |
| 1808 | 919644 |
| 1809 | 920147 |
| 1810 | 920650 |
| 1811 | 921153 |
| 1812 | 921656 |
| 1813 | 922160 |
| 1814 | 922663 |
| 1815 | 923166 |
| 1816 | 923669 |
| 1817 | 924172 |
| 1818 | 924676 |
| 1819 | 925179 |
| 1820 | 925682 |
| 1821 | 926185 |
| 1822 | 926688 |
| 1823 | 927192 |
| 1824 | 927695 |
| 1825 | 928198 |
| 1826 | 928701 |
| 1827 | 929204 |
| 1828 | 929708 |
| 1829 | 930211 |
| 1830 | 930714 |
| 1831 | 931217 |
| 1832 | 931720 |
| 1833 | 932223 |
| 1834 | 932727 |
| 1835 | 933230 |
| 1836 | 933733 |
| 1837 | 934236 |
| 1838 | 934740 |
| 1839 | 935243 |
| 1840 | 935746 |
| 1841 | 936249 |
| 1842 | 936752 |
| 1843 | 937256 |
| 1844 | 937759 |
| 1845 | 938262 |
| 1846 | 938765 |
| 1847 | 939268 |
| 1848 | 939772 |
| 1849 | 940275 |
| 1850 | 940778 |
| 1851 | 941281 |
| 1852 | 941784 |
| 1853 | 942287 |
| 1854 | 942791 |
| 1855 | 943294 |
| 1856 | 943797 |
| 1857 | 944300 |
| 1858 | 944803 |
| 1859 | 945307 |
| 1860 | 945810 |
| 1861 | 946313 |
| 1862 | 946816 |
| 1863 | 947319 |
| 1864 | 947823 |
| 1865 | 948326 |
| 1866 | 948829 |
| 1867 | 949332 |
| 1868 | 949835 |
| 1869 | 950339 |
| 1870 | 950842 |
| 1871 | 951345 |
| 1872 | 951848 |
| 1873 | 952351 |
| 1874 | 952855 |
| 1875 | 953358 |
| 1876 | 953861 |
| 1877 | 954364 |
| 1878 | 954867 |
| 1879 | 955371 |
| 1880 | 955874 |
| 1881 | 956377 |
| 1882 | 956880 |
| 1883 | 957383 |
| 1884 | 957887 |
| 1885 | 958390 |
| 1886 | 958893 |
| 1887 | 959396 |
| 1888 | 959899 |
| 1889 | 960403 |
| 1890 | 960906 |
| 1891 | 961409 |
| 1892 | 961912 |
| 1893 | 962415 |
| 1894 | 962918 |
| 1895 | 963422 |
| 1896 | 963925 |
| 1897 | 964428 |
| 1898 | 964931 |
| 1899 | 965435 |
| 1900 | 965938 |
| 1901 | 966441 |
| 1902 | 966944 |
| 1903 | 967447 |
| 1904 | 967951 |
| 1905 | 968454 |
| 1906 | 968957 |
| 1907 | 969460 |
| 1908 | 969963 |
| 1909 | 970466 |
| 1910 | 970970 |
| 1911 | 971473 |
| 1912 | 971976 |
| 1913 | 972479 |
| 1914 | 972982 |
| 1915 | 973485 |
| 1916 | 973989 |
| 1917 | 974492 |
| 1918 | 974995 |
| 1919 | 975498 |
| 1920 | 976002 |
| 1921 | 976505 |
| 1922 | 977008 |
| 1923 | 977511 |
| 1924 | 978014 |
| 1925 | 978518 |
| 1926 | 979021 |
| 1927 | 979524 |
| 1928 | 980027 |
| 1929 | 980530 |
| 1930 | 981034 |
| 1931 | 981537 |
| 1932 | 982040 |
| 1933 | 982543 |
| 1934 | 983046 |
| 1935 | 983550 |
| 1936 | 984053 |
| 1937 | 984556 |
| 1938 | 985059 |
| 1939 | 985562 |
| 1940 | 986066 |
| 1941 | 986569 |
| 1942 | 987072 |
| 1943 | 987575 |
| 1944 | 988078 |
| 1945 | 988582 |
| 1946 | 989085 |
| 1947 | 989588 |
| 1948 | 990091 |
| 1949 | 990594 |
| 1950 | 991097 |
| 1951 | 991601 |
| 1952 | 992104 |
| 1953 | 992607 |
| 1954 | 993110 |
| 1955 | 993613 |
| 1956 | 994117 |
| 1957 | 994620 |
| 1958 | 995123 |
| 1959 | 995626 |
| 1960 | 996129 |
| 1961 | 996633 |
| 1962 | 997136 |
| 1963 | 997639 |
| 1964 | 998142 |
| 1965 | 998645 |
| 1966 | 999149 |
| 1967 | 999652 |
| 1968 | 1000155 |
| 1969 | 1000658 |
| 1970 | 1001161 |
| 1971 | 1001665 |
| 1972 | 1002168 |
| 1973 | 1002671 |
| 1974 | 1003174 |
| 1975 | 1003677 |
| 1976 | 1004181 |
| 1977 | 1004684 |
| 1978 | 1005187 |
| 1979 | 1005690 |
| 1980 | 1006193 |
| 1981 | 1006697 |
| 1982 | 1007200 |
| 1983 | 1007703 |
| 1984 | 1008206 |
| 1985 | 1008709 |
| 1986 | 1009212 |
| 1987 | 1009716 |
| 1988 | 1010219 |
| 1989 | 1010722 |
| 1990 | 1011225 |
| 1991 | 1011729 |
| 1992 | 1012232 |
| 1993 | 1012735 |
| 1994 | 1013238 |
| 1995 | 1013741 |
| 1996 | 1014245 |
| 1997 | 1014748 |
| 1998 | 1015251 |
| 1999 | 1015754 |
| 2000 | 1016258 |
| 2001 | 1016761 |
| 2002 | 1017264 |
| 2003 | 1017767 |
| 2004 | 1018270 |
| 2005 | 1018774 |
| 2006 | 1019277 |
| 2007 | 1019780 |
| 2008 | 1020283 |
| 2009 | 1020786 |
| 2010 | 1021289 |
| 2011 | 1021793 |
| 2012 | 1022296 |
| 2013 | 1022799 |
| 2014 | 1023302 |
| 2015 | 1023805 |
| 2016 | 1024309 |
| 2017 | 1024812 |
| 2018 | 1025315 |
| 2019 | 1025818 |
| 2020 | 1026321 |
| 2021 | 1026825 |
| 2022 | 1027328 |
| 2023 | 1027831 |
| 2024 | 1028334 |
| 2025 | 1028837 |
| 2026 | 1029340 |
| 2027 | 1029844 |
| 2028 | 1030347 |
| 2029 | 1030850 |
| 2030 | 1031353 |
| 2031 | 1031856 |
| 2032 | 1032360 |
| 2033 | 1032863 |
| 2034 | 1033366 |
| 2035 | 1033869 |
| 2036 | 1034372 |
| 2037 | 1034876 |
| 2038 | 1035379 |
| 2039 | 1035882 |
| 2040 | 1036385 |
| 2041 | 1036888 |
| 2042 | 1037392 |
| 2043 | 1037895 |
| 2044 | 1038398 |
| 2045 | 1038901 |
| 2046 | 1039404 |
| 2047 | 1039908 |
| 2048 | 1040411 |
| 2049 | 1040914 |
| 2050 | 1041417 |
| 2051 | 1041920 |
| 2052 | 1042424 |
| 2053 | 1042927 |
| 2054 | 1043430 |
| 2055 | 1043933 |
| 2056 | 1044436 |
| 2057 | 1044940 |
| 2058 | 1045443 |
| 2059 | 1045946 |
| 2060 | 1046449 |
| 2061 | 1046952 |
| 2062 | 1047456 |
| 2063 | 1047959 |
| 2064 | 1048462 |
| 2065 | 1048965 |
| 2066 | 1049468 |
| 2067 | 1049972 |
| 2068 | 1050475 |
| 2069 | 1050978 |
| 2070 | 1051481 |
| 2071 | 1051984 |
| 2072 | 1052488 |
| 2073 | 1052991 |
| 2074 | 1053494 |
| 2075 | 1053997 |
| 2076 | 1054500 |
| 2077 | 1055003 |
| 2078 | 1055507 |
| 2079 | 1056010 |
| 2080 | 1056513 |
| 2081 | 1057016 |
| 2082 | 1057519 |
| 2083 | 1058023 |
| 2084 | 1058526 |
| 2085 | 1059029 |
| 2086 | 1059532 |
| 2087 | 1060036 |
| 2088 | 1060539 |
| 2089 | 1061042 |
| 2090 | 1061545 |
| 2091 | 1062048 |
| 2092 | 1062552 |
| 2093 | 1063055 |
| 2094 | 1063558 |
| 2095 | 1064061 |
| 2096 | 1064564 |
| 2097 | 1065067 |
| 2098 | 1065571 |
| 2099 | 1066074 |
| 2100 | 1066577 |
| 2101 | 1067080 |
| 2102 | 1067583 |
| 2103 | 1068087 |
| 2104 | 1068590 |
| 2105 | 1069093 |
| 2106 | 1069596 |
| 2107 | 1070099 |
| 2108 | 1070603 |
| 2109 | 1071106 |
| 2110 | 1071609 |
| 2111 | 1072112 |
| 2112 | 1072615 |
| 2113 | 1073119 |
| 2114 | 1073622 |
| 2115 | 1074125 |
| 2116 | 1074628 |
| 2117 | 1075131 |
| 2118 | 1075635 |
| 2119 | 1076138 |
| 2120 | 1076641 |
| 2121 | 1077144 |
| 2122 | 1077647 |
| 2123 | 1078151 |
| 2124 | 1078654 |
| 2125 | 1079157 |
| 2126 | 1079660 |
| 2127 | 1080163 |
| 2128 | 1080667 |
| 2129 | 1081170 |
| 2130 | 1081673 |
| 2131 | 1082176 |
| 2132 | 1082679 |
| 2133 | 1083183 |
| 2134 | 1083686 |
| 2135 | 1084189 |
| 2136 | 1084692 |
| 2137 | 1085195 |
| 2138 | 1085698 |
| 2139 | 1086201 |
| 2140 | 1086705 |
| 2141 | 1087208 |
| 2142 | 1087711 |
| 2143 | 1088215 |
| 2144 | 1088718 |
| 2145 | 1089221 |
| 2146 | 1089724 |
| 2147 | 1090227 |
| 2148 | 1090730 |
| 2149 | 1091233 |
| 2150 | 1091737 |
| 2151 | 1092240 |
| 2152 | 1092743 |
| 2153 | 1093246 |
| 2154 | 1093749 |
| 2155 | 1094253 |
| 2156 | 1094756 |
| 2157 | 1095259 |
| 2158 | 1095762 |
| 2159 | 1096266 |
| 2160 | 1096769 |
| 2161 | 1097272 |
| 2162 | 1097775 |
| 2163 | 1098292 |
| 2164 | 1098795 |
| 2165 | 1099298 |
| 2166 | 1099802 |
| 2167 | 1100305 |
| 2168 | 1100808 |
| 2169 | 1101311 |
| 2170 | 1101814 |
| 2171 | 1102318 |
| 2172 | 1102821 |
| 2173 | 1103324 |
| 2174 | 1103827 |
| 2175 | 1104330 |
| 2176 | 1104834 |
| 2177 | 1105337 |
| 2178 | 1105840 |
| 2179 | 1106343 |
| 2180 | 1106846 |
| 2181 | 1107350 |
| 2182 | 1107853 |
| 2183 | 1108356 |
| 2184 | 1108859 |
| 2185 | 1109362 |
| 2186 | 1109866 |
| 2187 | 1110369 |
| 2188 | 1110872 |
| 2189 | 1111375 |
| 2190 | 1111878 |
| 2191 | 1112382 |
| 2192 | 1112885 |
| 2193 | 1113388 |
| 2194 | 1113891 |
| 2195 | 1114394 |
| 2196 | 1114898 |
| 2197 | 1115401 |
| 2198 | 1115904 |
| 2199 | 1116407 |
| 2200 | 1116910 |
| 2201 | 1117414 |
| 2202 | 1117917 |
| 2203 | 1118420 |
| 2204 | 1118923 |
| 2205 | 1119426 |
| 2206 | 1119930 |
| 2207 | 1120433 |
| 2208 | 1120936 |
| 2209 | 1121439 |
| 2210 | 1121942 |
| 2211 | 1122446 |
| 2212 | 1122949 |
| 2213 | 1123452 |
| 2214 | 1123955 |
| 2215 | 1124458 |
| 2216 | 1124961 |
| 2217 | 1125465 |
| 2218 | 1125968 |
| 2219 | 1126471 |
| 2220 | 1126974 |
| 2221 | 1127477 |
| 2222 | 1127981 |
| 2223 | 1128484 |
| 2224 | 1128987 |
| 2225 | 1129490 |
| 2226 | 1129993 |
| 2227 | 1130497 |
| 2228 | 1131000 |
| 2229 | 1131503 |
| 2230 | 1132006 |
| 2231 | 1132509 |
| 2232 | 1133013 |
| 2233 | 1133516 |
| 2234 | 1134019 |
| 2235 | 1134522 |
| 2236 | 1135025 |
| 2237 | 1135529 |
| 2238 | 1136032 |
| 2239 | 1136535 |
| 2240 | 1137038 |
| 2241 | 1137542 |
| 2242 | 1138045 |
| 2243 | 1138548 |
| 2244 | 1139051 |
| 2245 | 1139554 |
| 2246 | 1140057 |
| 2247 | 1140561 |
| 2248 | 1141064 |
| 2249 | 1141567 |
| 2250 | 1142070 |
| 2251 | 1142574 |
| 2252 | 1143077 |
| 2253 | 1143580 |
| 2254 | 1144083 |
| 2255 | 1144586 |
| 2256 | 1145089 |
| 2257 | 1145593 |
| 2258 | 1146096 |
| 2259 | 1146599 |
| 2260 | 1147102 |
| 2261 | 1147605 |
| 2262 | 1148109 |
| 2263 | 1148612 |
| 2264 | 1149115 |
| 2265 | 1149618 |
| 2266 | 1150121 |
| 2267 | 1150625 |
| 2268 | 1151128 |
| 2269 | 1151631 |
| 2270 | 1152134 |
| 2271 | 1152637 |
| 2272 | 1153140 |
| 2273 | 1153644 |
| 2274 | 1154147 |
| 2275 | 1154650 |
| 2276 | 1155153 |
| 2277 | 1155656 |
| 2278 | 1156160 |
| 2279 | 1156663 |
| 2280 | 1157166 |
| 2281 | 1157669 |
| 2282 | 1158172 |
| 2283 | 1158676 |
| 2284 | 1159179 |
| 2285 | 1159682 |
| 2286 | 1160185 |
| 2287 | 1160688 |
| 2288 | 1161192 |
| 2289 | 1161695 |
| 2290 | 1162198 |
| 2291 | 1162701 |
| 2292 | 1163205 |
| 2293 | 1163708 |
| 2294 | 1164211 |
| 2295 | 1164714 |
| 2296 | 1165217 |
| 2297 | 1165720 |
| 2298 | 1166224 |
| 2299 | 1166727 |
| 2300 | 1167230 |
| 2301 | 1167733 |
| 2302 | 1168236 |
| 2303 | 1168739 |
| 2304 | 1169243 |
| 2305 | 1169746 |
| 2306 | 1170249 |
| 2307 | 1170752 |
| 2308 | 1171255 |
| 2309 | 1171759 |
| 2310 | 1172262 |
| 2311 | 1172765 |
| 2312 | 1173268 |
| 2313 | 1173772 |
| 2314 | 1174275 |
| 2315 | 1174778 |
| 2316 | 1175281 |
| 2317 | 1175784 |
| 2318 | 1176288 |
| 2319 | 1176791 |
| 2320 | 1177294 |
| 2321 | 1177797 |
| 2322 | 1178300 |
| 2323 | 1178804 |
| 2324 | 1179320 |
| 2325 | 1179824 |
| 2326 | 1180327 |
| 2327 | 1180830 |
| 2328 | 1181333 |
| 2329 | 1181836 |
| 2330 | 1182340 |
| 2331 | 1182843 |
| 2332 | 1183346 |
| 2333 | 1183849 |
| 2334 | 1184352 |
| 2335 | 1184855 |
| 2336 | 1185359 |
| 2337 | 1185862 |
| 2338 | 1186365 |
| 2339 | 1186868 |
| 2340 | 1187371 |
| 2341 | 1187875 |
| 2342 | 1188378 |
| 2343 | 1188881 |
| 2344 | 1189384 |
| 2345 | 1189887 |
| 2346 | 1190391 |
| 2347 | 1190894 |
| 2348 | 1191397 |
| 2349 | 1191900 |
| 2350 | 1192403 |
| 2351 | 1192907 |
| 2352 | 1193410 |
| 2353 | 1193913 |
| 2354 | 1194416 |
| 2355 | 1194919 |
| 2356 | 1195423 |
| 2357 | 1195926 |
| 2358 | 1196429 |
| 2359 | 1196932 |
| 2360 | 1197435 |
| 2361 | 1197938 |
| 2362 | 1198442 |
| 2363 | 1198945 |
| 2364 | 1199448 |
| 2365 | 1199951 |
| 2366 | 1200455 |
| 2367 | 1200958 |
| 2368 | 1201461 |
| 2369 | 1201964 |
| 2370 | 1202467 |
| 2371 | 1202971 |
| 2372 | 1203474 |
| 2373 | 1203977 |
| 2374 | 1204480 |
| 2375 | 1204983 |
| 2376 | 1205487 |
| 2377 | 1205990 |
| 2378 | 1206493 |
| 2379 | 1206996 |
| 2380 | 1207499 |
| 2381 | 1208003 |
| 2382 | 1208506 |
| 2383 | 1209009 |
| 2384 | 1209512 |
| 2385 | 1210015 |
| 2386 | 1210519 |
| 2387 | 1211022 |
| 2388 | 1211525 |
| 2389 | 1212028 |
| 2390 | 1212531 |
| 2391 | 1213034 |
| 2392 | 1213538 |
| 2393 | 1214041 |
| 2394 | 1214544 |
| 2395 | 1215047 |
| 2396 | 1215550 |
| 2397 | 1216054 |
| 2398 | 1216557 |
| 2399 | 1217060 |
| 2400 | 1217563 |
| 2401 | 1218066 |
| 2402 | 1218570 |
| 2403 | 1219073 |
| 2404 | 1219576 |
| 2405 | 1220079 |
| 2406 | 1220582 |
| 2407 | 1221086 |
| 2408 | 1221589 |
| 2409 | 1222092 |
| 2410 | 1222595 |
| 2411 | 1223098 |
| 2412 | 1223602 |
| 2413 | 1224105 |
| 2414 | 1224608 |
| 2415 | 1225111 |
| 2416 | 1225614 |
| 2417 | 1226118 |
| 2418 | 1226621 |
| 2419 | 1227124 |
| 2420 | 1227627 |
| 2421 | 1228130 |
| 2422 | 1228634 |
| 2423 | 1229137 |
| 2424 | 1229640 |
| 2425 | 1230143 |
| 2426 | 1230646 |
| 2427 | 1231149 |
| 2428 | 1231653 |
| 2429 | 1232156 |
| 2430 | 1232659 |
| 2431 | 1233162 |
| 2432 | 1233665 |
| 2433 | 1234169 |
| 2434 | 1234672 |
| 2435 | 1235175 |
| 2436 | 1235678 |
| 2437 | 1236181 |
| 2438 | 1236685 |
| 2439 | 1237188 |
| 2440 | 1237691 |
| 2441 | 1238194 |
| 2442 | 1238697 |
| 2443 | 1239201 |
| 2444 | 1239704 |
| 2445 | 1240207 |
| 2446 | 1240710 |
| 2447 | 1241213 |
| 2448 | 1241717 |
| 2449 | 1242220 |
| 2450 | 1242723 |
| 2451 | 1243226 |
| 2452 | 1243729 |
| 2453 | 1244232 |
| 2454 | 1244736 |
| 2455 | 1245239 |
| 2456 | 1245742 |
| 2457 | 1246245 |
| 2458 | 1246748 |
| 2459 | 1247252 |
| 2460 | 1247755 |
| 2461 | 1248258 |
| 2462 | 1248761 |
| 2463 | 1249265 |
| 2464 | 1249768 |
| 2465 | 1250271 |
| 2466 | 1250774 |
| 2467 | 1251277 |
| 2468 | 1251780 |
| 2469 | 1252284 |
| 2470 | 1252787 |
| 2471 | 1253290 |
| 2472 | 1253793 |
| 2473 | 1254296 |
| 2474 | 1254800 |
| 2475 | 1255303 |
| 2476 | 1255806 |
| 2477 | 1256309 |
| 2478 | 1256812 |
| 2479 | 1257316 |
| 2480 | 1257819 |
| 2481 | 1258322 |
| 2482 | 1258825 |
| 2483 | 1259328 |
| 2484 | 1259832 |
| 2485 | 1260335 |
| 2486 | 1260838 |
| 2487 | 1261341 |
| 2488 | 1261844 |
| 2489 | 1262348 |
| 2490 | 1262851 |
| 2491 | 1263354 |
| 2492 | 1263857 |
| 2493 | 1264360 |
| 2494 | 1264864 |
| 2495 | 1265367 |
| 2496 | 1265870 |
| 2497 | 1266373 |
| 2498 | 1266877 |
| 2499 | 1267380 |
| 2500 | 1267883 |
| 2501 | 1268386 |
| 2502 | 1268889 |
| 2503 | 1269392 |
| 2504 | 1269896 |
| 2505 | 1270399 |
| 2506 | 1270902 |
| 2507 | 1271405 |
| 2508 | 1271909 |
| 2509 | 1272412 |
| 2510 | 1272915 |
| 2511 | 1273418 |
| 2512 | 1273921 |
| 2513 | 1274425 |
| 2514 | 1274928 |
| 2515 | 1275431 |
| 2516 | 1275934 |
| 2517 | 1276437 |
| 2518 | 1276941 |
| 2519 | 1277444 |
| 2520 | 1277947 |
| 2521 | 1278450 |
| 2522 | 1278953 |
| 2523 | 1279457 |
| 2524 | 1279960 |
| 2525 | 1280463 |
| 2526 | 1280966 |
| 2527 | 1281469 |
| 2528 | 1281972 |
| 2529 | 1282476 |
| 2530 | 1282979 |
| 2531 | 1283482 |
| 2532 | 1283985 |
| 2533 | 1284488 |
| 2534 | 1284991 |
| 2535 | 1285495 |
| 2536 | 1285998 |
| 2537 | 1286501 |
| 2538 | 1287004 |
| 2539 | 1287507 |
| 2540 | 1288011 |
| 2541 | 1288514 |
| 2542 | 1289017 |
| 2543 | 1289520 |
| 2544 | 1290023 |
| 2545 | 1290527 |
| 2546 | 1291030 |
| 2547 | 1291533 |
| 2548 | 1292036 |
| 2549 | 1292540 |
| 2550 | 1293043 |
| 2551 | 1293546 |
| 2552 | 1294049 |
| 2553 | 1294552 |
| 2554 | 1295055 |
| 2555 | 1295559 |
| 2556 | 1296062 |
| 2557 | 1296565 |
| 2558 | 1297068 |
| 2559 | 1297571 |
| 2560 | 1298075 |
| 2561 | 1298578 |
| 2562 | 1299081 |
| 2563 | 1299584 |
| 2564 | 1300087 |
| 2565 | 1300591 |
| 2566 | 1301094 |
| 2567 | 1301597 |
| 2568 | 1302100 |
| 2569 | 1302603 |
| 2570 | 1303107 |
| 2571 | 1303610 |
| 2572 | 1304113 |
| 2573 | 1304616 |
| 2574 | 1305119 |
| 2575 | 1305623 |
| 2576 | 1306126 |
| 2577 | 1306629 |
| 2578 | 1307132 |
| 2579 | 1307635 |
| 2580 | 1308139 |
| 2581 | 1308642 |
| 2582 | 1309145 |
| 2583 | 1309648 |
| 2584 | 1310151 |
| 2585 | 1310655 |
| 2586 | 1311158 |
| 2587 | 1311661 |
| 2588 | 1312164 |
| 2589 | 1312667 |
| 2590 | 1313170 |
| 2591 | 1313674 |
| 2592 | 1314177 |
| 2593 | 1314680 |
| 2594 | 1315183 |
| 2595 | 1315686 |
| 2596 | 1316190 |
| 2597 | 1316693 |
| 2598 | 1317196 |
| 2599 | 1317699 |
| 2600 | 1318202 |
| 2601 | 1318706 |
| 2602 | 1319209 |
| 2603 | 1319712 |
| 2604 | 1320215 |
| 2605 | 1320719 |
| 2606 | 1321222 |
| 2607 | 1321725 |
| 2608 | 1322228 |
| 2609 | 1322731 |
| 2610 | 1323234 |
| 2611 | 1323737 |
| 2612 | 1324241 |
| 2613 | 1324744 |
| 2614 | 1325247 |
| 2615 | 1325750 |
| 2616 | 1326254 |
| 2617 | 1326757 |
| 2618 | 1327260 |
| 2619 | 1327763 |
| 2620 | 1328266 |
| 2621 | 1328769 |
| 2622 | 1329273 |
| 2623 | 1329776 |
| 2624 | 1330279 |
| 2625 | 1330782 |
| 2626 | 1331286 |
| 2627 | 1331789 |
| 2628 | 1332292 |
| 2629 | 1332795 |
| 2630 | 1333298 |
| 2631 | 1333801 |
| 2632 | 1334305 |
| 2633 | 1334808 |
| 2634 | 1335311 |
| 2635 | 1335814 |
| 2636 | 1336317 |
| 2637 | 1336821 |
| 2638 | 1337324 |
| 2639 | 1337827 |
| 2640 | 1338330 |
| 2641 | 1338833 |
| 2642 | 1339337 |
| 2643 | 1339840 |
| 2644 | 1340343 |
| 2645 | 1340846 |
| 2646 | 1341349 |
| 2647 | 1341853 |
| 2648 | 1342356 |
| 2649 | 1342859 |
| 2650 | 1343362 |
| 2651 | 1343865 |
| 2652 | 1344369 |
| 2653 | 1344872 |
| 2654 | 1345375 |
| 2655 | 1345878 |
| 2656 | 1346381 |
| 2657 | 1346885 |
| 2658 | 1347388 |
| 2659 | 1347891 |
| 2660 | 1348394 |
| 2661 | 1348897 |
| 2662 | 1349401 |
| 2663 | 1349904 |
| 2664 | 1350407 |
| 2665 | 1350910 |
| 2666 | 1351413 |
| 2667 | 1351917 |
| 2668 | 1352420 |
| 2669 | 1352923 |
| 2670 | 1353426 |
| 2671 | 1353929 |
| 2672 | 1354433 |
| 2673 | 1354936 |
| 2674 | 1355439 |
| 2675 | 1355942 |
| 2676 | 1356445 |
| 2677 | 1356949 |
| 2678 | 1357452 |
| 2679 | 1357955 |
| 2680 | 1358458 |
| 2681 | 1358961 |
| 2682 | 1359464 |
| 2683 | 1359968 |
| 2684 | 1360471 |
| 2685 | 1360974 |
| 2686 | 1361477 |
| 2687 | 1361980 |
| 2688 | 1362484 |
| 2689 | 1362987 |
| 2690 | 1363490 |
| 2691 | 1363993 |
| 2692 | 1364496 |
| 2693 | 1365000 |
| 2694 | 1365503 |
| 2695 | 1366006 |
| 2696 | 1366509 |
| 2697 | 1367012 |
| 2698 | 1367516 |
| 2699 | 1368019 |
| 2700 | 1368522 |
| 2701 | 1369025 |
| 2702 | 1369529 |
| 2703 | 1370032 |
| 2704 | 1370535 |
| 2705 | 1371038 |
| 2706 | 1371541 |
| 2707 | 1372045 |
| 2708 | 1372548 |
| 2709 | 1373051 |
| 2710 | 1373554 |
| 2711 | 1374057 |
| 2712 | 1374561 |
| 2713 | 1375064 |
| 2714 | 1375567 |
| 2715 | 1376070 |
| 2716 | 1376573 |
| 2717 | 1377077 |
| 2718 | 1377580 |
| 2719 | 1378083 |
| 2720 | 1378586 |
| 2721 | 1379089 |
| 2722 | 1379593 |
| 2723 | 1380096 |
| 2724 | 1380599 |
| 2725 | 1381102 |
| 2726 | 1381605 |
| 2727 | 1382109 |
| 2728 | 1382612 |
| 2729 | 1383115 |
| 2730 | 1383618 |
| 2731 | 1384121 |
| 2732 | 1384625 |
| 2733 | 1385128 |
| 2734 | 1385631 |
| 2735 | 1386134 |
| 2736 | 1386637 |
| 2737 | 1387140 |
| 2738 | 1387644 |
| 2739 | 1388147 |
| 2740 | 1388650 |
| 2741 | 1389153 |
| 2742 | 1389656 |
| 2743 | 1390160 |
| 2744 | 1390663 |
| 2745 | 1391166 |
| 2746 | 1391669 |
| 2747 | 1392172 |
| 2748 | 1392676 |
| 2749 | 1393179 |
| 2750 | 1393682 |
| 2751 | 1394185 |
| 2752 | 1394688 |
| 2753 | 1395192 |
| 2754 | 1395695 |
| 2755 | 1396198 |
| 2756 | 1396701 |
| 2757 | 1397204 |
| 2758 | 1397708 |
| 2759 | 1398211 |
| 2760 | 1398714 |
| 2761 | 1399217 |
| 2762 | 1399720 |
| 2763 | 1400224 |
| 2764 | 1400727 |
| 2765 | 1401230 |
| 2766 | 1401733 |
| 2767 | 1402236 |
| 2768 | 1402740 |
| 2769 | 1403243 |
| 2770 | 1403746 |
| 2771 | 1404249 |
| 2772 | 1404752 |
| 2773 | 1405256 |
| 2774 | 1405759 |
| 2775 | 1406262 |
| 2776 | 1406765 |
| 2777 | 1407268 |
| 2778 | 1407771 |
| 2779 | 1408275 |
| 2780 | 1408778 |
| 2781 | 1409281 |
| 2782 | 1409784 |
| 2783 | 1410287 |
| 2784 | 1410791 |
| 2785 | 1411294 |
| 2786 | 1411797 |
| 2787 | 1412300 |
| 2788 | 1412803 |
| 2789 | 1413307 |
| 2790 | 1413810 |